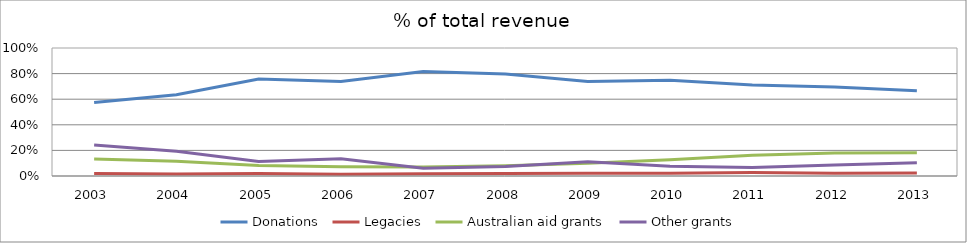
| Category | Donations  | Legacies  | Australian aid grants  | Other grants  |
|---|---|---|---|---|
| 2003 | 0.574 | 0.019 | 0.132 | 0.242 |
| 2004 | 0.635 | 0.016 | 0.115 | 0.193 |
| 2005 | 0.758 | 0.019 | 0.082 | 0.113 |
| 2006 | 0.738 | 0.014 | 0.073 | 0.135 |
| 2007 | 0.816 | 0.018 | 0.069 | 0.06 |
| 2008 | 0.796 | 0.019 | 0.08 | 0.075 |
| 2009 | 0.738 | 0.022 | 0.099 | 0.112 |
| 2010 | 0.748 | 0.022 | 0.127 | 0.076 |
| 2011 | 0.711 | 0.027 | 0.163 | 0.066 |
| 2012 | 0.696 | 0.022 | 0.181 | 0.086 |
| 2013 | 0.667 | 0.023 | 0.181 | 0.104 |